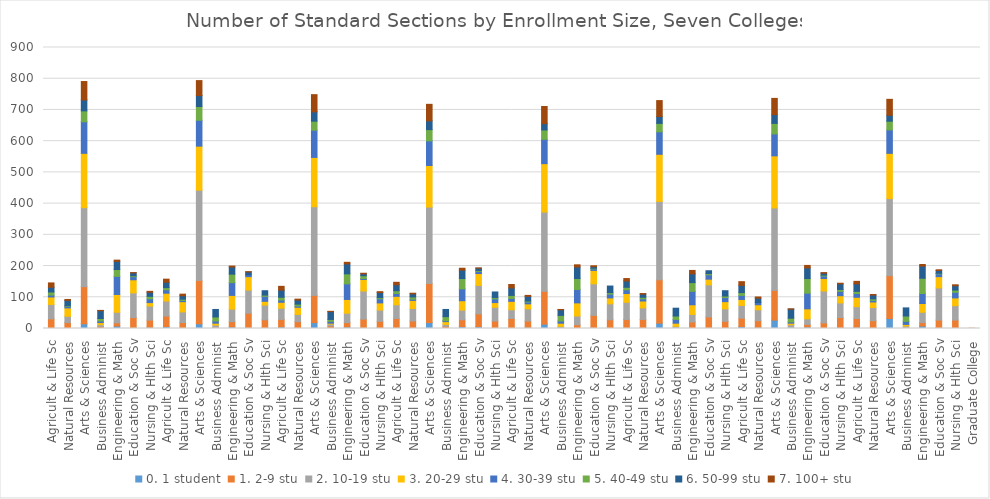
| Category | 0. 1 student | 1. 2-9 stu | 2. 10-19 stu | 3. 20-29 stu | 4. 30-39 stu | 5. 40-49 stu | 6. 50-99 stu | 7. 100+ stu |
|---|---|---|---|---|---|---|---|---|
| 0 | 1 | 30 | 46 | 24 | 6 | 10 | 15 | 14 |
| 1 | 1 | 18 | 20 | 27 | 5 | 2 | 17 | 3 |
| 2 | 15 | 119 | 253 | 174 | 101 | 35 | 35 | 59 |
| 3 | 0 | 6 | 6 | 7 | 5 | 8 | 25 | 1 |
| 4 | 8 | 10 | 34 | 57 | 58 | 22 | 26 | 4 |
| 5 | 2 | 33 | 79 | 42 | 10 | 3 | 9 | 1 |
| 6 | 4 | 23 | 45 | 11 | 12 | 8 | 13 | 3 |
| 7 | 6 | 34 | 48 | 25 | 11 | 7 | 17 | 10 |
| 8 | 0 | 19 | 34 | 33 | 4 | 4 | 11 | 5 |
| 9 | 15 | 139 | 289 | 141 | 83 | 44 | 35 | 48 |
| 10 | 2 | 2 | 7 | 6 | 7 | 13 | 24 | 0 |
| 11 | 5 | 17 | 40 | 44 | 41 | 27 | 23 | 3 |
| 12 | 2 | 47 | 74 | 43 | 6 | 0 | 9 | 1 |
| 13 | 3 | 25 | 47 | 12 | 16 | 4 | 14 | 0 |
| 14 | 5 | 24 | 36 | 19 | 7 | 9 | 23 | 12 |
| 15 | 3 | 19 | 23 | 23 | 4 | 6 | 13 | 3 |
| 16 | 19 | 87 | 284 | 158 | 87 | 29 | 30 | 55 |
| 17 | 1 | 7 | 6 | 3 | 6 | 6 | 25 | 1 |
| 18 | 5 | 14 | 30 | 44 | 50 | 32 | 32 | 5 |
| 19 | 2 | 28 | 90 | 37 | 3 | 9 | 6 | 2 |
| 20 | 3 | 20 | 36 | 23 | 13 | 4 | 16 | 3 |
| 21 | 2 | 30 | 44 | 27 | 9 | 9 | 19 | 8 |
| 22 | 3 | 21 | 40 | 26 | 4 | 7 | 10 | 2 |
| 23 | 19 | 125 | 245 | 133 | 79 | 36 | 28 | 53 |
| 24 | 2 | 5 | 6 | 9 | 3 | 13 | 23 | 0 |
| 25 | 6 | 22 | 31 | 30 | 38 | 33 | 27 | 6 |
| 26 | 6 | 41 | 91 | 38 | 7 | 3 | 7 | 1 |
| 27 | 0 | 24 | 44 | 15 | 12 | 4 | 18 | 0 |
| 28 | 2 | 30 | 28 | 27 | 9 | 10 | 24 | 11 |
| 29 | 4 | 20 | 39 | 16 | 6 | 3 | 15 | 3 |
| 30 | 14 | 105 | 254 | 155 | 78 | 30 | 20 | 55 |
| 31 | 0 | 2 | 5 | 10 | 7 | 18 | 18 | 1 |
| 32 | 0 | 12 | 28 | 42 | 43 | 35 | 37 | 7 |
| 33 | 3 | 39 | 101 | 43 | 5 | 2 | 5 | 3 |
| 34 | 2 | 26 | 51 | 19 | 12 | 5 | 21 | 0 |
| 35 | 1 | 28 | 55 | 28 | 12 | 8 | 20 | 8 |
| 36 | 3 | 26 | 37 | 22 | 7 | 5 | 10 | 2 |
| 37 | 17 | 139 | 251 | 151 | 72 | 27 | 22 | 51 |
| 38 | 0 | 1 | 6 | 10 | 12 | 11 | 25 | 0 |
| 39 | 0 | 21 | 24 | 31 | 43 | 28 | 28 | 11 |
| 40 | 0 | 37 | 103 | 18 | 14 | 4 | 9 | 0 |
| 41 | 2 | 21 | 40 | 23 | 13 | 5 | 17 | 0 |
| 42 | 6 | 27 | 41 | 19 | 13 | 9 | 23 | 12 |
| 43 | 4 | 21 | 35 | 16 | 7 | 0 | 14 | 4 |
| 44 | 27 | 95 | 264 | 167 | 70 | 34 | 28 | 52 |
| 45 | 0 | 2 | 10 | 5 | 4 | 12 | 29 | 1 |
| 46 | 5 | 8 | 18 | 32 | 50 | 47 | 34 | 8 |
| 47 | 0 | 18 | 102 | 40 | 8 | 3 | 6 | 2 |
| 48 | 3 | 32 | 47 | 23 | 14 | 6 | 18 | 2 |
| 49 | 4 | 28 | 38 | 30 | 12 | 7 | 24 | 8 |
| 50 | 3 | 22 | 42 | 18 | 5 | 5 | 12 | 2 |
| 51 | 32 | 137 | 247 | 145 | 75 | 28 | 19 | 51 |
| 52 | 0 | 1 | 7 | 5 | 10 | 17 | 26 | 0 |
| 53 | 8 | 11 | 33 | 28 | 32 | 49 | 39 | 5 |
| 54 | 3 | 24 | 103 | 36 | 9 | 2 | 9 | 2 |
| 55 | 2 | 25 | 46 | 25 | 18 | 7 | 14 | 3 |
| 56 | 0 | 1 | 0 | 0 | 0 | 0 | 0 | 0 |